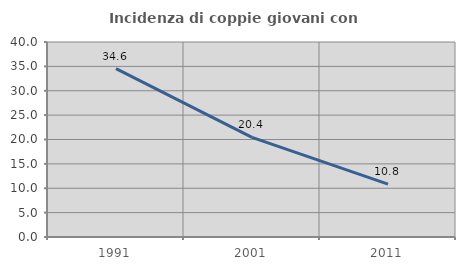
| Category | Incidenza di coppie giovani con figli |
|---|---|
| 1991.0 | 34.553 |
| 2001.0 | 20.438 |
| 2011.0 | 10.838 |